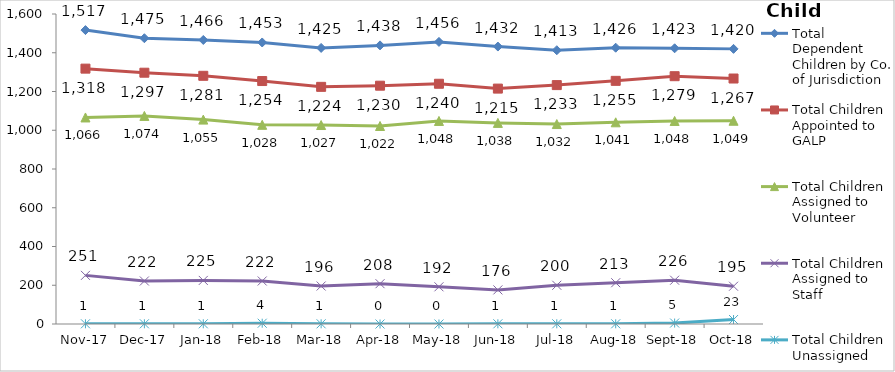
| Category | Total Dependent Children by Co. of Jurisdiction | Total Children Appointed to GALP | Total Children Assigned to Volunteer | Total Children Assigned to Staff | Total Children Unassigned |
|---|---|---|---|---|---|
| 2017-11-01 | 1517 | 1318 | 1066 | 251 | 1 |
| 2017-12-01 | 1475 | 1297 | 1074 | 222 | 1 |
| 2018-01-01 | 1466 | 1281 | 1055 | 225 | 1 |
| 2018-02-01 | 1453 | 1254 | 1028 | 222 | 4 |
| 2018-03-01 | 1425 | 1224 | 1027 | 196 | 1 |
| 2018-04-01 | 1438 | 1230 | 1022 | 208 | 0 |
| 2018-05-01 | 1456 | 1240 | 1048 | 192 | 0 |
| 2018-06-01 | 1432 | 1215 | 1038 | 176 | 1 |
| 2018-07-01 | 1413 | 1233 | 1032 | 200 | 1 |
| 2018-08-01 | 1426 | 1255 | 1041 | 213 | 1 |
| 2018-09-01 | 1423 | 1279 | 1048 | 226 | 5 |
| 2018-10-01 | 1420 | 1267 | 1049 | 195 | 23 |